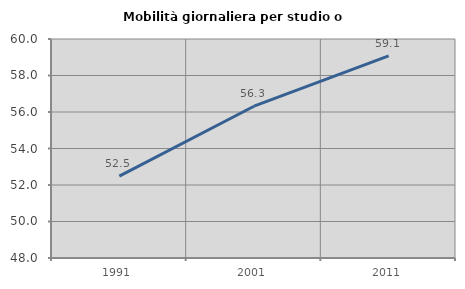
| Category | Mobilità giornaliera per studio o lavoro |
|---|---|
| 1991.0 | 52.487 |
| 2001.0 | 56.317 |
| 2011.0 | 59.073 |